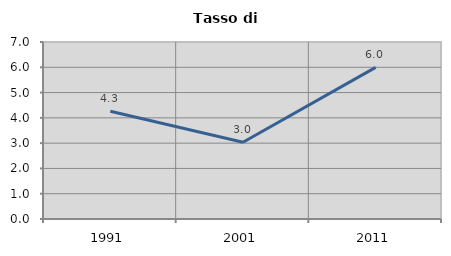
| Category | Tasso di disoccupazione   |
|---|---|
| 1991.0 | 4.263 |
| 2001.0 | 3.037 |
| 2011.0 | 5.997 |